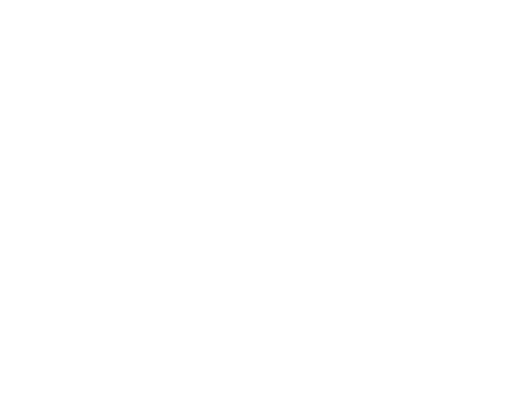
| Category | Series 0 | Series 1 | Series 2 |
|---|---|---|---|
| Impuestos | 5269343.57 | 0.084 |  |
| Cuotas y Aportaciones de Seguridad Social | 0 | 0 |  |
| Contribuciones de Mejoras | 0 | 0 |  |
| Derechos | 3495100.76 | 0.055 |  |
| Productos | 23564.19 | 0 |  |
| Aprovechamientos | 94215.19 | 0.001 |  |
| Ingresos por Ventas de Bienes y Servicios | 0 | 0 |  |
| Participaciones y Aportaciones | 52583840.37 | 0.834 |  |
| Transferencias, Asignaciones, Subsidios y Otras Ayudas | 1566358.79 | 0.025 |  |
| Ingresos Derivados de Financiamientos | 0 | 0 |  |